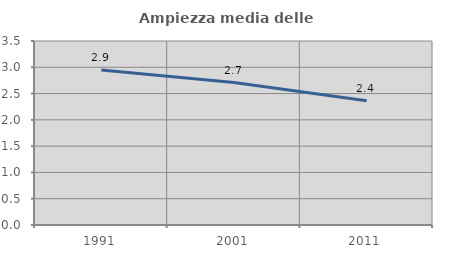
| Category | Ampiezza media delle famiglie |
|---|---|
| 1991.0 | 2.947 |
| 2001.0 | 2.709 |
| 2011.0 | 2.362 |